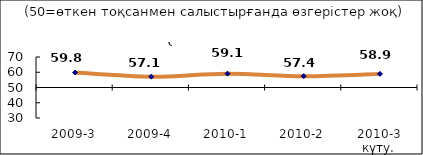
| Category | Диф.индекс ↓ |
|---|---|
| 2009-3 | 59.79 |
| 2009-4 | 57.085 |
| 2010-1 | 59.075 |
| 2010-2 | 57.41 |
| 2010-3 күту. | 58.935 |